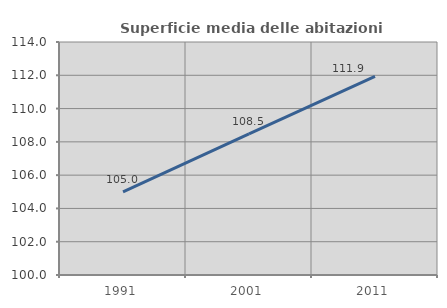
| Category | Superficie media delle abitazioni occupate |
|---|---|
| 1991.0 | 104.992 |
| 2001.0 | 108.474 |
| 2011.0 | 111.938 |